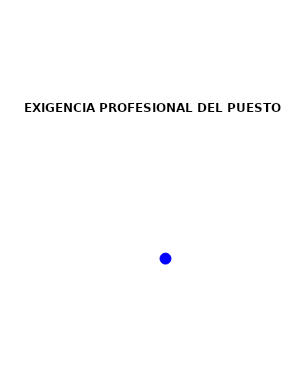
| Category | Series 0 |
|---|---|
| 5.5 | 3 |